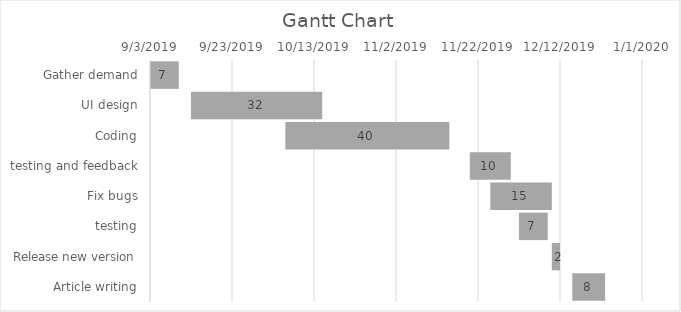
| Category | Series 0 | Duration |
|---|---|---|
| Gather demand | 9/3/19 | 7 |
| UI design | 9/13/19 | 32 |
| Coding | 10/6/19 | 40 |
| testing and feedback | 11/20/19 | 10 |
| Fix bugs | 11/25/19 | 15 |
| testing | 12/2/19 | 7 |
| Release new version | 12/10/19 | 2 |
| Article writing | 12/15/19 | 8 |